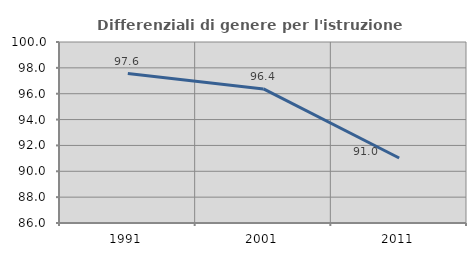
| Category | Differenziali di genere per l'istruzione superiore |
|---|---|
| 1991.0 | 97.558 |
| 2001.0 | 96.37 |
| 2011.0 | 91.026 |